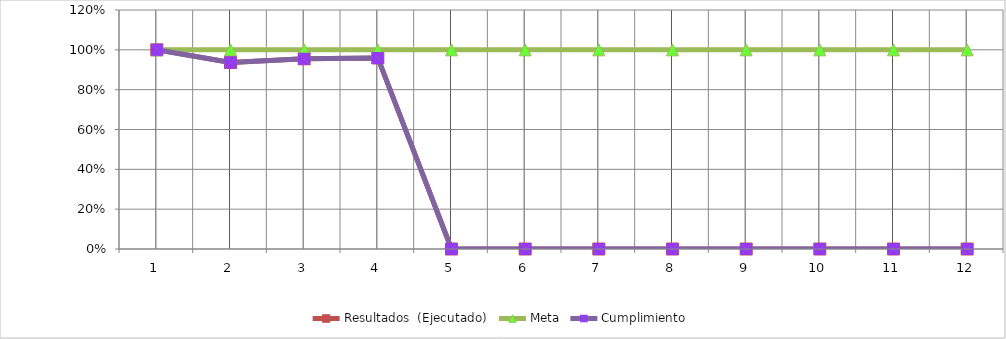
| Category | Resultados  (Ejecutado) | Meta | Cumplimiento |
|---|---|---|---|
| 0 | 1 | 1 | 1 |
| 1 | 0.937 | 1 | 0.937 |
| 2 | 0.955 | 1 | 0.955 |
| 3 | 0.959 | 1 | 0.959 |
| 4 | 0 | 1 | 0 |
| 5 | 0 | 1 | 0 |
| 6 | 0 | 1 | 0 |
| 7 | 0 | 1 | 0 |
| 8 | 0 | 1 | 0 |
| 9 | 0 | 1 | 0 |
| 10 | 0 | 1 | 0 |
| 11 | 0 | 1 | 0 |